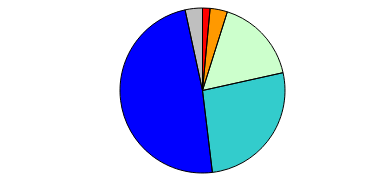
| Category | Series 0 |
|---|---|
| 0 | 10 |
| 1 | 23 |
| 2 | 113 |
| 3 | 180 |
| 4 | 329 |
| 5 | 23 |